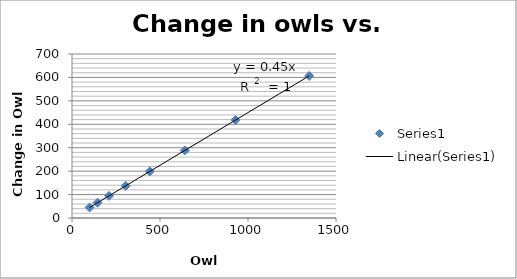
| Category | Series 0 |
|---|---|
| 100.0 | 45 |
| 145.0 | 65.25 |
| 210.25 | 94.613 |
| 304.8625 | 137.188 |
| 442.050625 | 198.923 |
| 640.97340625 | 288.438 |
| 929.4114390625 | 418.235 |
| 1347.646586640625 | 606.441 |